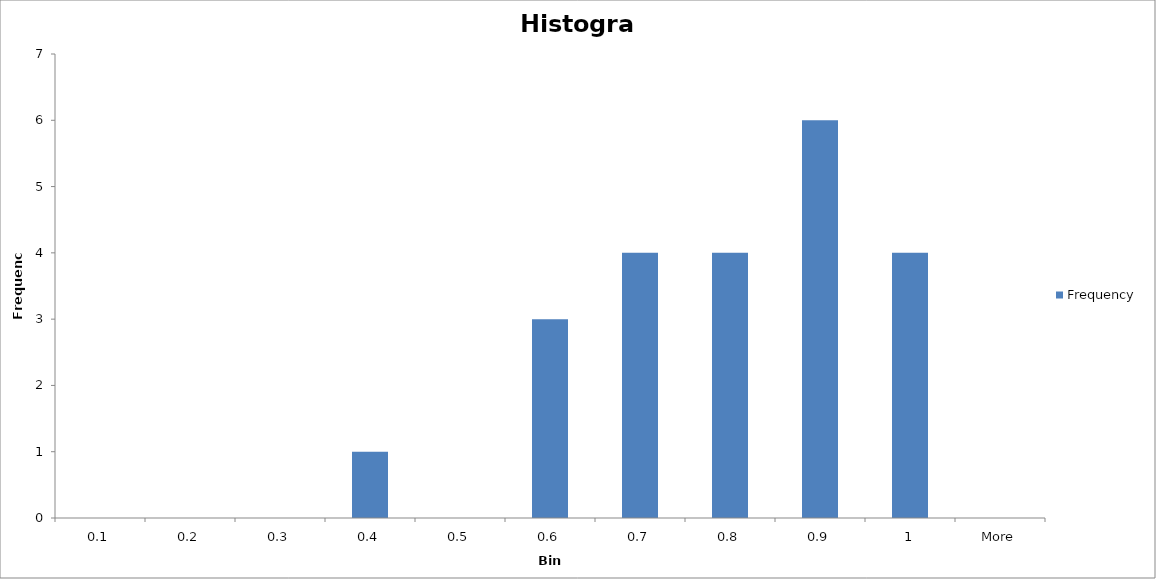
| Category | Frequency |
|---|---|
| 0.1 | 0 |
| 0.2 | 0 |
| 0.3 | 0 |
| 0.4 | 1 |
| 0.5 | 0 |
| 0.6 | 3 |
| 0.7 | 4 |
| 0.8 | 4 |
| 0.9 | 6 |
| 1 | 4 |
| More | 0 |